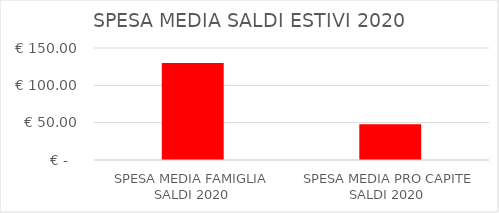
| Category | Series 0 |
|---|---|
| SPESA MEDIA FAMIGLIA SALDI 2020 | 130 |
| SPESA MEDIA PRO CAPITE SALDI 2020  | 48 |